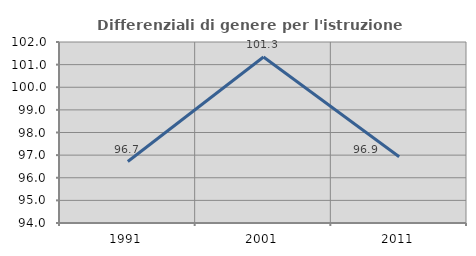
| Category | Differenziali di genere per l'istruzione superiore |
|---|---|
| 1991.0 | 96.716 |
| 2001.0 | 101.337 |
| 2011.0 | 96.929 |